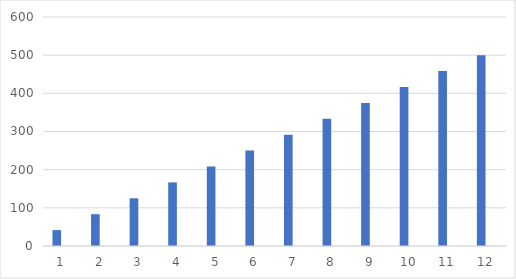
| Category | Ziel | Stunden |
|---|---|---|
| 0 | 41.667 | 0 |
| 1 | 83.333 | 0 |
| 2 | 125 | 0 |
| 3 | 166.667 | 0 |
| 4 | 208.333 | 0 |
| 5 | 250 | 0 |
| 6 | 291.667 | 0 |
| 7 | 333.333 | 0 |
| 8 | 375 | 0 |
| 9 | 416.667 | 0 |
| 10 | 458.333 | 0 |
| 11 | 500 | 0 |